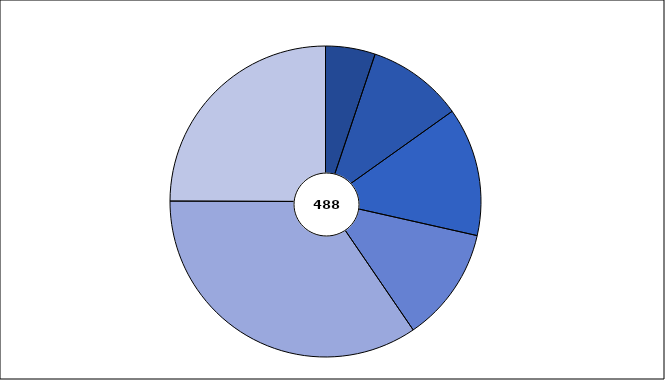
| Category | Series 1 |
|---|---|
| 0 | 29 |
| 1 | 56 |
| 2 | 75 |
| 3 | 67 |
| 4 | 194 |
| 5 | 140 |